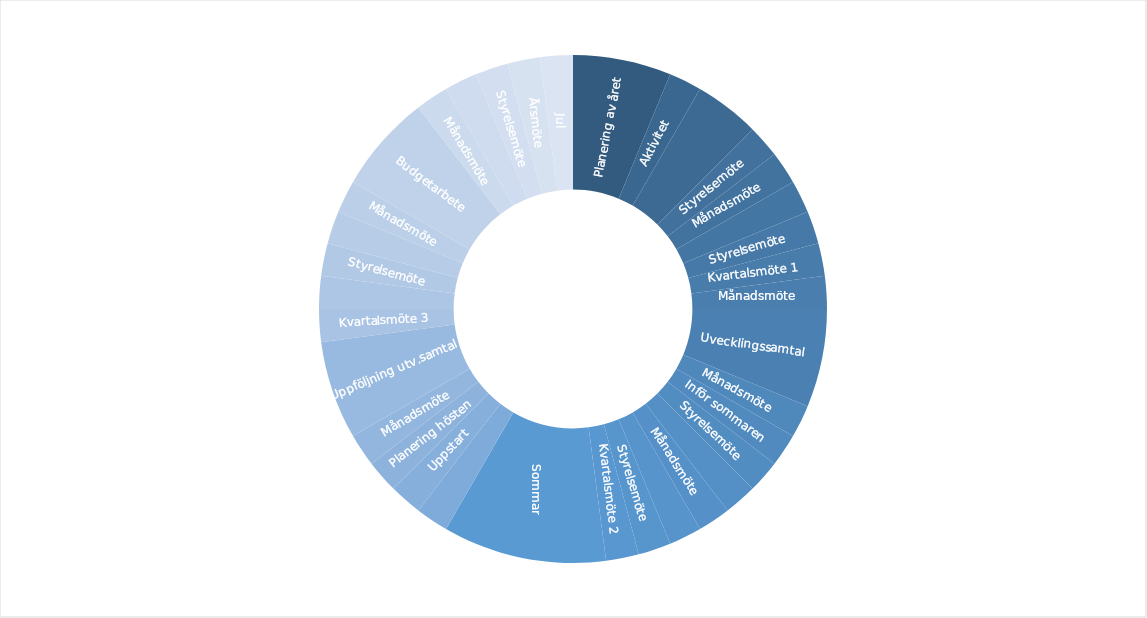
| Category | Series 0 |
|---|---|
| Planering av året | 3 |
|   | 0 |
|   | 0 |
| Aktivitet | 1 |
|   | 2 |
|   | 0 |
| Styrelsemöte | 1 |
| Månadsmöte | 1 |
|   | 1 |
| Styrelsemöte | 1 |
| Kvartalsmöte 1 | 1 |
| Månadsmöte | 1 |
| Uvecklingssamtal | 3 |
|   | 0 |
|   | 0 |
| Månadsmöte | 1 |
| Inför sommaren | 1 |
| Styrelsemöte | 1 |
|   | 1 |
| Månadsmöte | 1 |
|   | 1 |
| Styrelsemöte | 1 |
| Kvartalsmöte 2 | 1 |
| Sommar | 5 |
|  | 0 |
|   | 0 |
|   | 0 |
|   | 0 |
|   | 1 |
| Uppstart | 1 |
| Planering hösten | 1 |
| Månadsmöte | 1 |
| Uppföljning utv.samtal | 3 |
|   | 0 |
|   | 0 |
| Kvartalsmöte 3 | 1 |
|   | 1 |
| Styrelsemöte | 1 |
|   | 1 |
| Månadsmöte | 1 |
| Budgetarbete | 3 |
|   | 0 |
|   | 0 |
| Månadsmöte | 1 |
|   | 1 |
| Styrelsemöte | 1 |
| Årsmöte | 1 |
| Jul | 1 |